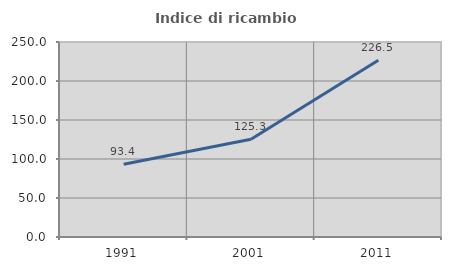
| Category | Indice di ricambio occupazionale  |
|---|---|
| 1991.0 | 93.392 |
| 2001.0 | 125.314 |
| 2011.0 | 226.549 |